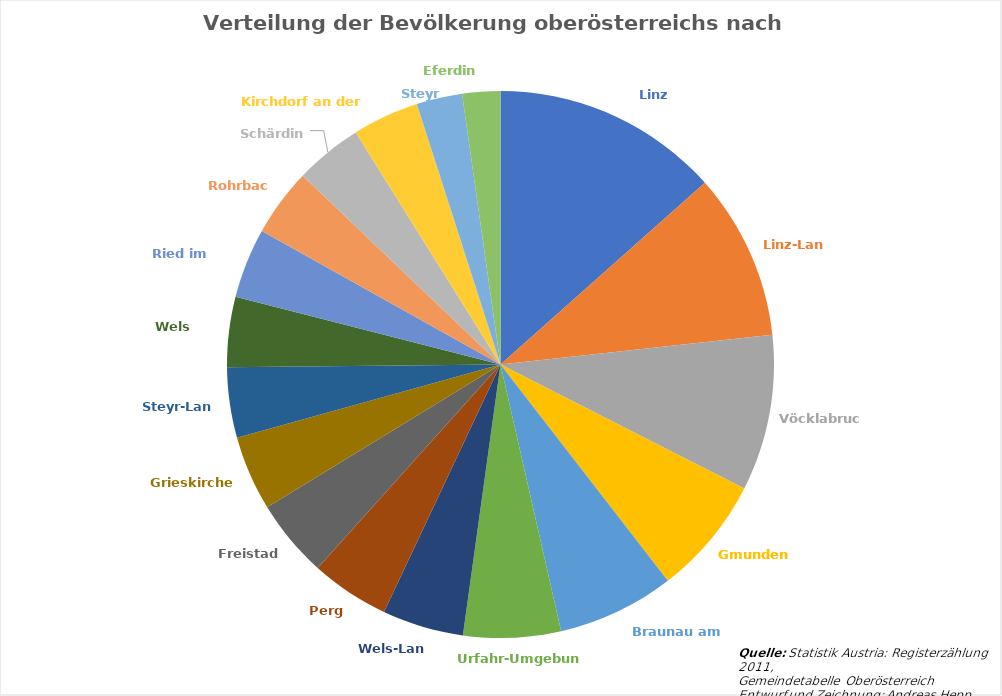
| Category | Bevölkerungszahl 2011 |
|---|---|
| Linz (Stadt) | 189889 |
| Linz-Land | 139116 |
| Vöcklabruck | 130316 |
| Gmunden | 99403 |
| Braunau am Inn | 97826 |
| Urfahr-Umgebung | 81400 |
| Wels-Land | 67945 |
| Perg | 65738 |
| Freistadt | 65113 |
| Grieskirchen | 62555 |
| Steyr-Land | 58700 |
| Wels (Stadt) | 58591 |
| Ried im Innkreis | 58553 |
| Rohrbach | 56688 |
| Schärding | 56426 |
| Kirchdorf an der Krems | 55557 |
| Steyr (Stadt) | 38205 |
| Eferding | 31741 |